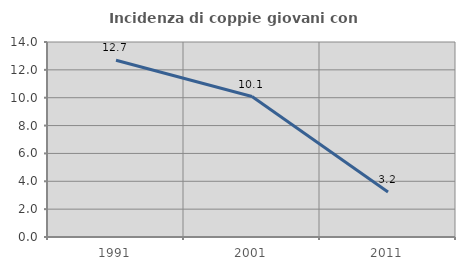
| Category | Incidenza di coppie giovani con figli |
|---|---|
| 1991.0 | 12.687 |
| 2001.0 | 10.084 |
| 2011.0 | 3.226 |